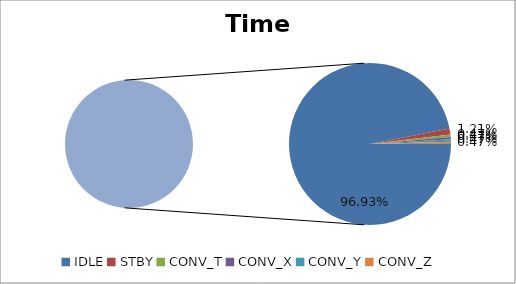
| Category | Series 1 | Series 0 |
|---|---|---|
| IDLE | 40 | 40 |
| STBY | 0.5 | 0.5 |
| CONV_T | 0.192 | 0.192 |
| CONV_X | 0.192 | 0.192 |
| CONV_Y | 0.192 | 0.192 |
| CONV_Z | 0.192 | 0.192 |